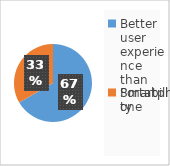
| Category | Series 0 |
|---|---|
| Better user experience than Smartphone | 4 |
| Portability | 2 |